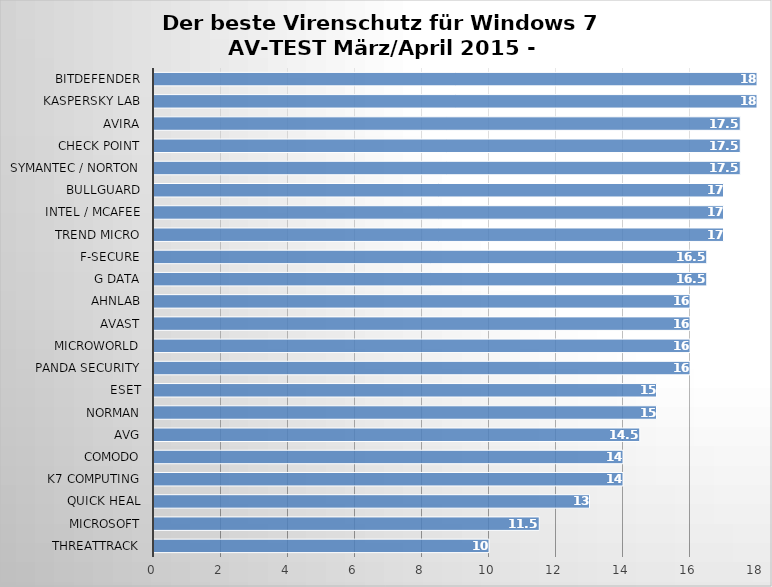
| Category | Series 0 |
|---|---|
| ThreatTrack | 10 |
| Microsoft | 11.5 |
| Quick Heal | 13 |
| K7 Computing | 14 |
| Comodo | 14 |
| AVG | 14.5 |
| Norman | 15 |
| ESET | 15 |
| Panda Security | 16 |
| Microworld | 16 |
| Avast | 16 |
| AhnLab | 16 |
| G Data | 16.5 |
| F-Secure | 16.5 |
| Trend Micro | 17 |
| Intel / McAfee | 17 |
| BullGuard | 17 |
| Symantec / Norton | 17.5 |
| Check Point | 17.5 |
| Avira | 17.5 |
| Kaspersky Lab | 18 |
| Bitdefender | 18 |